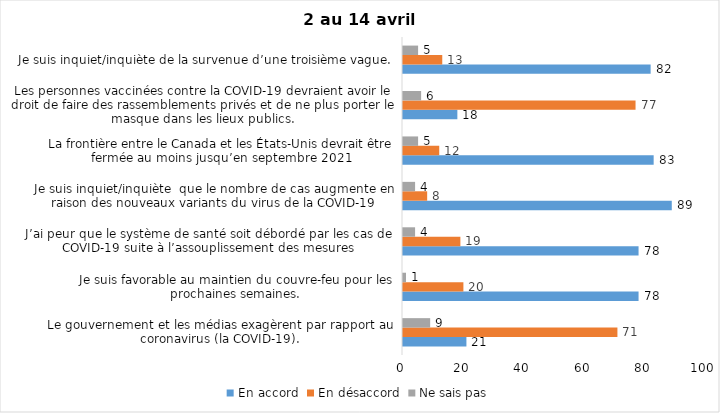
| Category | En accord | En désaccord | Ne sais pas |
|---|---|---|---|
| Le gouvernement et les médias exagèrent par rapport au coronavirus (la COVID-19). | 21 | 71 | 9 |
| Je suis favorable au maintien du couvre-feu pour les prochaines semaines. | 78 | 20 | 1 |
| J’ai peur que le système de santé soit débordé par les cas de COVID-19 suite à l’assouplissement des mesures | 78 | 19 | 4 |
| Je suis inquiet/inquiète  que le nombre de cas augmente en raison des nouveaux variants du virus de la COVID-19 | 89 | 8 | 4 |
| La frontière entre le Canada et les États-Unis devrait être fermée au moins jusqu’en septembre 2021 | 83 | 12 | 5 |
| Les personnes vaccinées contre la COVID-19 devraient avoir le droit de faire des rassemblements privés et de ne plus porter le masque dans les lieux publics. | 18 | 77 | 6 |
| Je suis inquiet/inquiète de la survenue d’une troisième vague. | 82 | 13 | 5 |